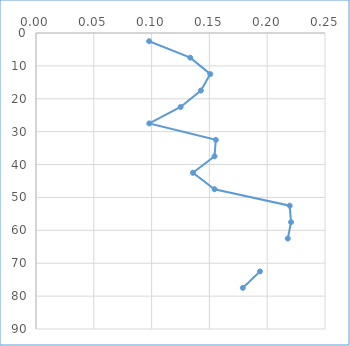
| Category | Series 0 |
|---|---|
| 0.0978773584905661 | 2.5 |
| 0.133458419077593 | 7.5 |
| 0.150775336902344 | 12.5 |
| 0.142622950819672 | 17.5 |
| 0.125109222336961 | 22.5 |
| 0.0980177717019823 | 27.5 |
| 0.155563480741797 | 32.5 |
| 0.154449553692183 | 37.5 |
| 0.135759493670886 | 42.5 |
| 0.154443309499489 | 47.5 |
| 0.219440353460972 | 52.5 |
| 0.220626470224093 | 57.5 |
| 0.217787114845939 | 62.5 |
| nan | 67.5 |
| 0.193705635850509 | 72.5 |
| 0.178921770670184 | 77.5 |